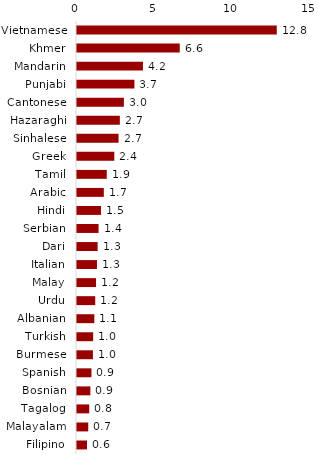
| Category | Series 0 |
|---|---|
| Vietnamese | 12.805 |
| Khmer | 6.587 |
| Mandarin | 4.227 |
| Punjabi | 3.681 |
| Cantonese | 3.006 |
| Hazaraghi | 2.747 |
| Sinhalese | 2.663 |
| Greek | 2.392 |
| Tamil | 1.907 |
| Arabic | 1.719 |
| Hindi | 1.538 |
| Serbian | 1.382 |
| Dari | 1.323 |
| Italian | 1.28 |
| Malay | 1.22 |
| Urdu | 1.169 |
| Albanian | 1.11 |
| Turkish | 1.035 |
| Burmese | 1.021 |
| Spanish | 0.928 |
| Bosnian | 0.857 |
| Tagalog | 0.785 |
| Malayalam | 0.72 |
| Filipino | 0.641 |